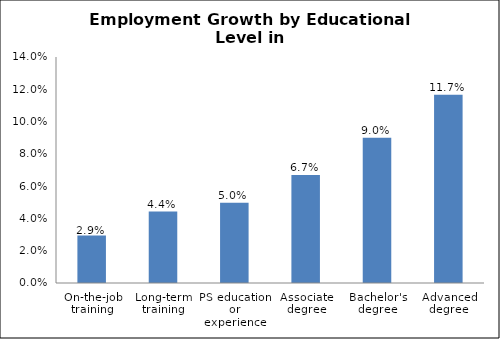
| Category | Series 0 |
|---|---|
| On-the-job training | 0.029 |
| Long-term training | 0.044 |
| PS education or experience | 0.05 |
| Associate degree | 0.067 |
| Bachelor's degree | 0.09 |
| Advanced degree | 0.117 |